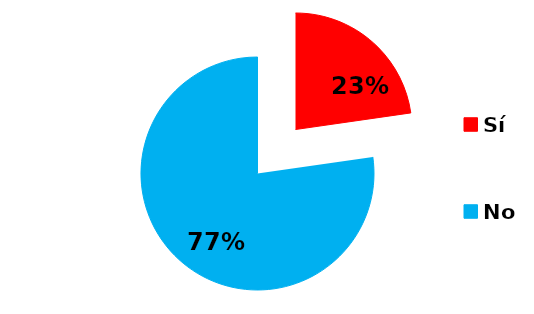
| Category | Series 0 |
|---|---|
| Sí | 30 |
| No | 102 |